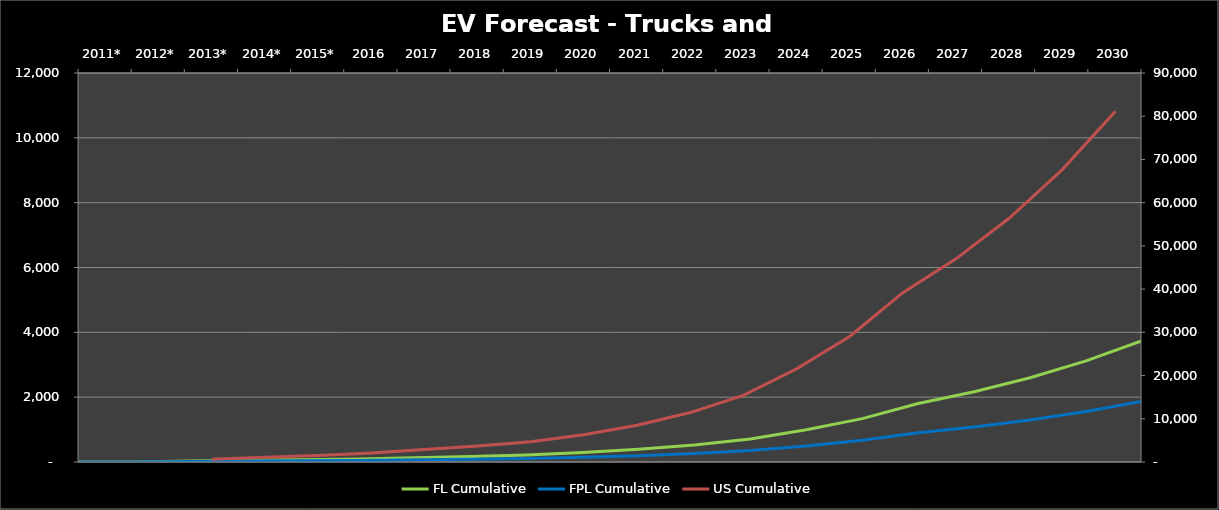
| Category | FL Cumulative | FPL Cumulative |
|---|---|---|
| 0 | 0 | 0 |
| 1 | 0 | 0 |
| 2 | 34.295 | 17 |
| 3 | 55.784 | 28 |
| 4 | 72.805 | 36 |
| 5 | 95.892 | 48 |
| 6 | 132.204 | 66 |
| 7 | 169.989 | 85 |
| 8 | 216.484 | 108 |
| 9 | 290.903 | 145 |
| 10 | 391.357 | 196 |
| 11 | 526.971 | 263 |
| 12 | 710.047 | 355 |
| 13 | 992.517 | 496 |
| 14 | 1338.532 | 669 |
| 15 | 1805.645 | 903 |
| 16 | 2165.99 | 1083 |
| 17 | 2598.405 | 1299 |
| 18 | 3117.312 | 1559 |
| 19 | 3739.991 | 1870 |